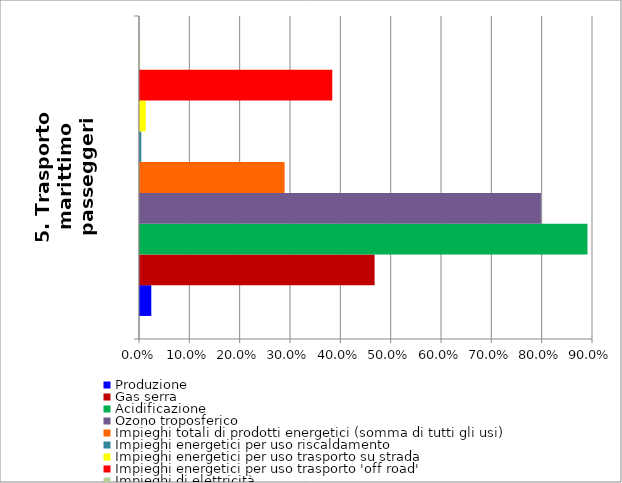
| Category | Produzione | Gas serra | Acidificazione | Ozono troposferico | Impieghi totali di prodotti energetici (somma di tutti gli usi) | Impieghi energetici per uso riscaldamento | Impieghi energetici per uso trasporto su strada | Impieghi energetici per uso trasporto 'off road' | Impieghi di elettricità |
|---|---|---|---|---|---|---|---|---|---|
| 5. Trasporto marittimo passeggeri | 0.022 | 0.466 | 0.889 | 0.797 | 0.287 | 0.003 | 0.011 | 0.382 | 0 |